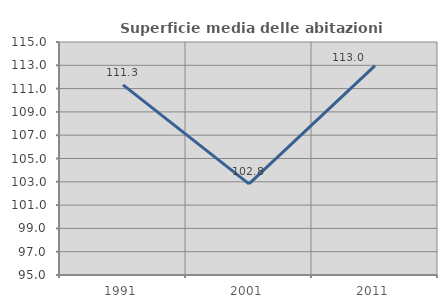
| Category | Superficie media delle abitazioni occupate |
|---|---|
| 1991.0 | 111.325 |
| 2001.0 | 102.822 |
| 2011.0 | 112.968 |